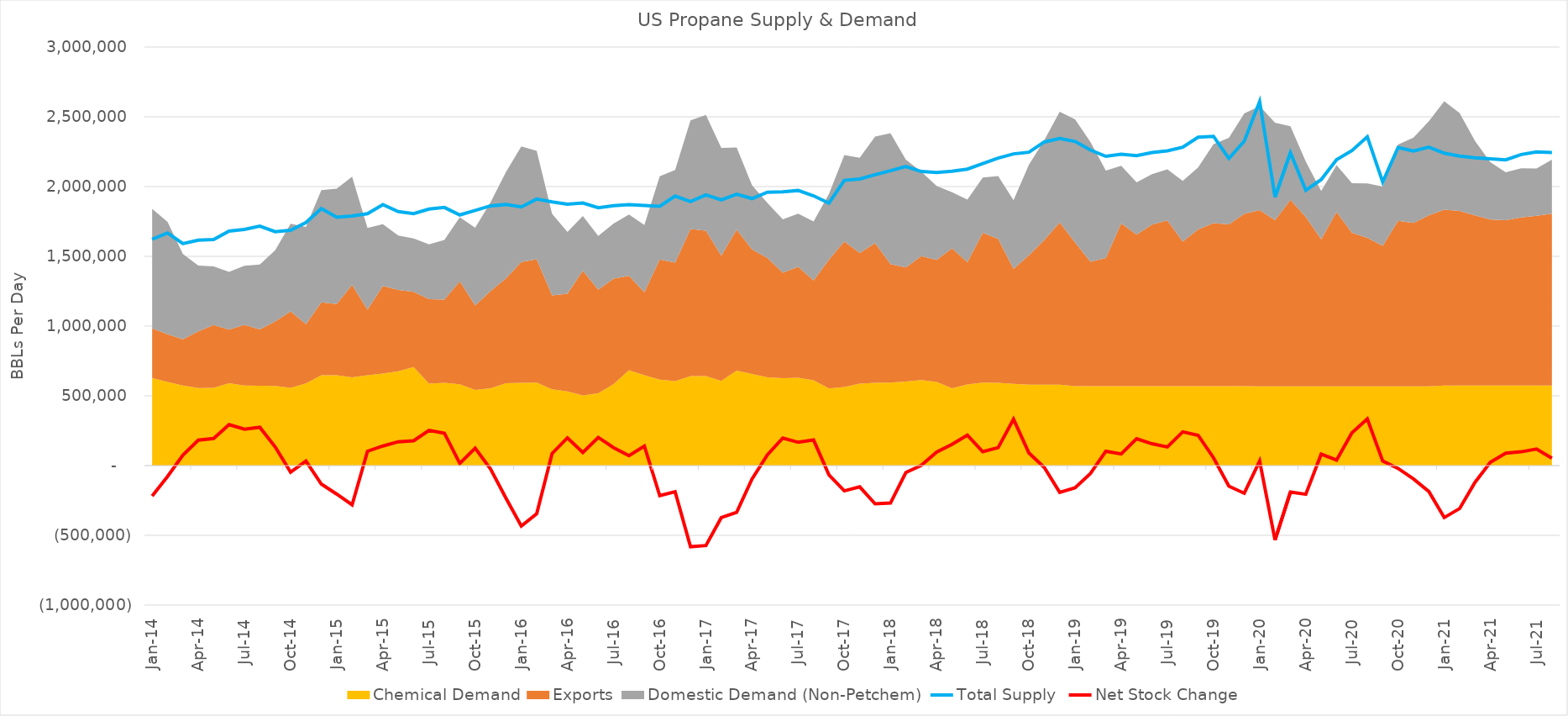
| Category | Total Supply  | Net Stock Change  |
|---|---|---|
| 2014-01-15 | 1622096.774 | -218812.004 |
| 2014-02-15 | 1667821.429 | -78513.781 |
| 2014-03-15 | 1591032.258 | 74364.262 |
| 2014-04-15 | 1615666.667 | 182207.802 |
| 2014-05-15 | 1620741.935 | 193736.502 |
| 2014-06-15 | 1681100 | 293050.86 |
| 2014-07-15 | 1692967.742 | 261088.504 |
| 2014-08-15 | 1716129.032 | 274528.162 |
| 2014-09-15 | 1677000 | 133607.39 |
| 2014-10-15 | 1686709.677 | -46792.743 |
| 2014-11-15 | 1742100 | 31982.998 |
| 2014-12-15 | 1841806.452 | -132653.105 |
| 2015-01-15 | 1780129.032 | -204661.372 |
| 2015-02-15 | 1789500 | -281201.886 |
| 2015-03-15 | 1805612.903 | 102788.25 |
| 2015-04-15 | 1870600 | 140352.809 |
| 2015-05-15 | 1820290.323 | 170704.641 |
| 2015-06-15 | 1806333.333 | 177689.058 |
| 2015-07-15 | 1838838.71 | 252485.588 |
| 2015-08-15 | 1850225.806 | 232166.674 |
| 2015-09-15 | 1796500 | 16077.309 |
| 2015-10-15 | 1829354.839 | 125142.748 |
| 2015-11-15 | 1862033.333 | -24429.85 |
| 2015-12-15 | 1871193.548 | -233155.946 |
| 2016-01-15 | 1854225.806 | -433807.116 |
| 2016-02-15 | 1910482.759 | -344954.67 |
| 2016-03-15 | 1890225.806 | 86050.25 |
| 2016-04-15 | 1873600 | 198952.211 |
| 2016-05-15 | 1882548.387 | 93436.076 |
| 2016-06-15 | 1848600 | 202097.179 |
| 2016-07-15 | 1862903.226 | 128000.653 |
| 2016-08-15 | 1870387.097 | 71346.679 |
| 2016-09-15 | 1864706.768 | 140225.543 |
| 2016-10-15 | 1858399.241 | -215469.31 |
| 2016-11-15 | 1931774.435 | -187649.831 |
| 2016-12-15 | 1892723.822 | -581602.206 |
| 2017-01-15 | 1940660.306 | -573193.799 |
| 2017-02-15 | 1903811.882 | -373222.104 |
| 2017-03-15 | 1945275.209 | -334968.793 |
| 2017-04-15 | 1913879.435 | -95813.261 |
| 2017-05-15 | 1959309.467 | 77208.867 |
| 2017-06-15 | 1962100 | 197463.175 |
| 2017-07-15 | 1971967.742 | 166694.729 |
| 2017-08-15 | 1933510.444 | 183314.166 |
| 2017-09-15 | 1881212.027 | -66547.321 |
| 2017-10-15 | 2044613.619 | -181194.289 |
| 2017-11-15 | 2054398.489 | -152314.362 |
| 2017-12-15 | 2084671.157 | -274333.4 |
| 2018-01-15 | 2113450.393 | -268758.608 |
| 2018-02-15 | 2143647.86 | -49639.725 |
| 2018-03-15 | 2108130.29 | 1712.803 |
| 2018-04-15 | 2101524.814 | 96421.608 |
| 2018-05-15 | 2110293.223 | 151703.929 |
| 2018-06-15 | 2125167.44 | 217850.972 |
| 2018-07-15 | 2164567.713 | 99130.761 |
| 2018-08-15 | 2203928.897 | 128939.214 |
| 2018-09-15 | 2234354.001 | 332504.369 |
| 2018-10-15 | 2246171.603 | 90221.547 |
| 2018-11-15 | 2319715.176 | -13701.306 |
| 2018-12-15 | 2344218.297 | -191915.327 |
| 2019-01-15 | 2323381.599 | -159214.638 |
| 2019-02-15 | 2262188.646 | -56891.146 |
| 2019-03-15 | 2216760.238 | 102679.047 |
| 2019-04-15 | 2232300.624 | 83258.594 |
| 2019-05-15 | 2222084.98 | 192367.44 |
| 2019-06-15 | 2244446.543 | 156312.921 |
| 2019-07-15 | 2256431.088 | 133095.439 |
| 2019-08-15 | 2281871.665 | 241835.108 |
| 2019-09-15 | 2354193.174 | 217307.813 |
| 2019-10-15 | 2360246.456 | 55913.839 |
| 2019-11-15 | 2201236.179 | -147668.356 |
| 2019-12-15 | 2325011.149 | -198508.845 |
| 2020-01-15 | 2609069.9 | 32087.635 |
| 2020-02-15 | 1924419.929 | -533448.857 |
| 2020-03-15 | 2242835.635 | -189964.436 |
| 2020-04-15 | 1973734.276 | -205757.772 |
| 2020-05-15 | 2050115.633 | 81619.511 |
| 2020-06-15 | 2193278.419 | 39521.413 |
| 2020-07-15 | 2257966.102 | 234610.14 |
| 2020-08-15 | 2356465.245 | 334199.188 |
| 2020-09-15 | 2032857.654 | 32547.781 |
| 2020-10-15 | 2279874.817 | -20909.69 |
| 2020-11-15 | 2254300.935 | -96197.297 |
| 2020-12-15 | 2282121.604 | -186033.238 |
| 2021-01-15 | 2239040.235 | -372787.222 |
| 2021-02-15 | 2218712.706 | -308150.843 |
| 2021-03-15 | 2206175.888 | -119982.401 |
| 2021-04-15 | 2198553.654 | 24373.726 |
| 2021-05-15 | 2191828.442 | 89402.44 |
| 2021-06-15 | 2229699.332 | 98777.239 |
| 2021-07-15 | 2247816.833 | 118685.08 |
| 2021-08-15 | 2244536.571 | 52312.324 |